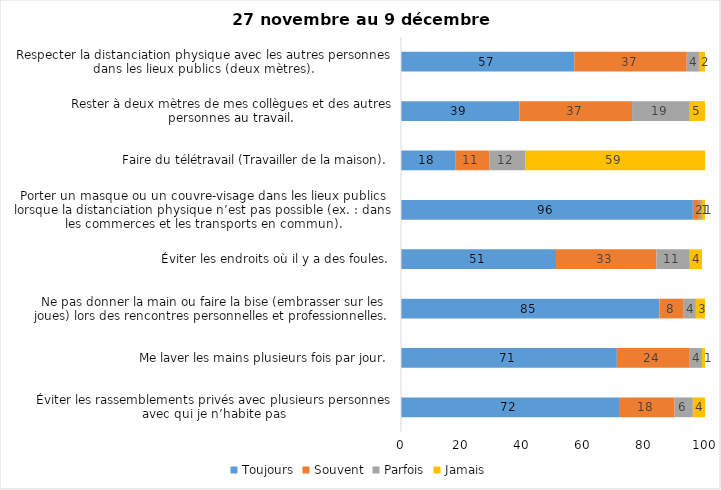
| Category | Toujours | Souvent | Parfois | Jamais |
|---|---|---|---|---|
| Éviter les rassemblements privés avec plusieurs personnes avec qui je n’habite pas | 72 | 18 | 6 | 4 |
| Me laver les mains plusieurs fois par jour. | 71 | 24 | 4 | 1 |
| Ne pas donner la main ou faire la bise (embrasser sur les joues) lors des rencontres personnelles et professionnelles. | 85 | 8 | 4 | 3 |
| Éviter les endroits où il y a des foules. | 51 | 33 | 11 | 4 |
| Porter un masque ou un couvre-visage dans les lieux publics lorsque la distanciation physique n’est pas possible (ex. : dans les commerces et les transports en commun). | 96 | 2 | 1 | 1 |
| Faire du télétravail (Travailler de la maison). | 18 | 11 | 12 | 59 |
| Rester à deux mètres de mes collègues et des autres personnes au travail. | 39 | 37 | 19 | 5 |
| Respecter la distanciation physique avec les autres personnes dans les lieux publics (deux mètres). | 57 | 37 | 4 | 2 |